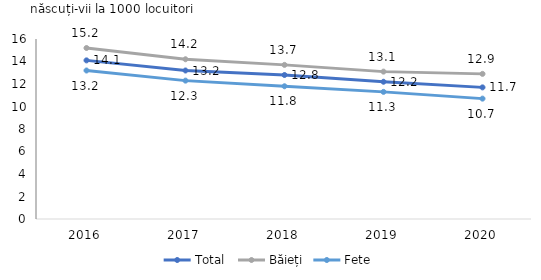
| Category | Total  | Băieți | Fete |
|---|---|---|---|
| 2016.0 | 14.1 | 15.2 | 13.2 |
| 2017.0 | 13.2 | 14.2 | 12.3 |
| 2018.0 | 12.8 | 13.7 | 11.8 |
| 2019.0 | 12.2 | 13.1 | 11.3 |
| 2020.0 | 11.7 | 12.9 | 10.7 |